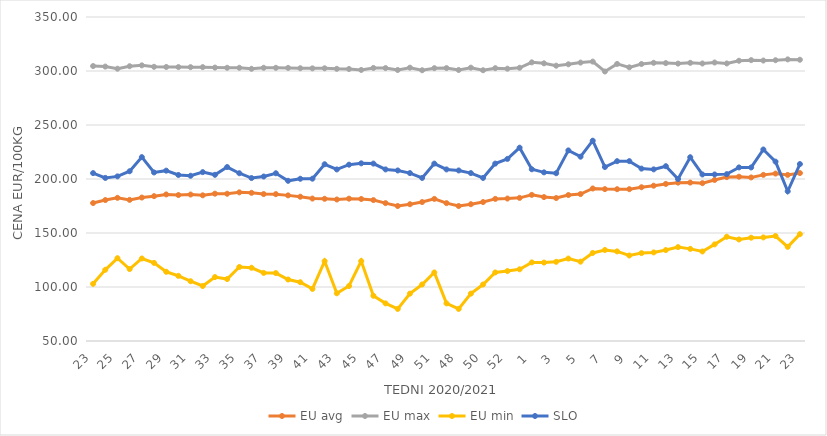
| Category | EU avg | EU max | EU min | SLO |
|---|---|---|---|---|
| 23.0 | 177.741 | 304.59 | 102.918 | 205.46 |
| 24.0 | 180.501 | 304.1 | 115.936 | 201 |
| 25.0 | 182.568 | 302.13 | 126.655 | 202.43 |
| 26.0 | 180.667 | 304.43 | 116.597 | 207.19 |
| 27.0 | 182.833 | 305.22 | 126.397 | 220.25 |
| 28.0 | 184.121 | 303.88 | 122.317 | 206.06 |
| 29.0 | 185.712 | 303.73 | 114.082 | 207.73 |
| 30.0 | 185.141 | 303.63 | 110.314 | 203.73 |
| 31.0 | 185.621 | 303.57 | 105.336 | 203 |
| 32.0 | 184.887 | 303.58 | 100.908 | 206.36 |
| 33.0 | 186.411 | 303.17 | 109.191 | 203.88 |
| 34.0 | 186.338 | 302.96 | 107.355 | 211.07 |
| 35.0 | 187.628 | 302.99 | 118.534 | 205.34 |
| 36.0 | 187.19 | 302.05 | 117.814 | 200.88 |
| 37.0 | 186.038 | 302.98 | 113.058 | 202.29 |
| 38.0 | 185.986 | 302.94 | 112.896 | 205.33 |
| 39.0 | 184.836 | 302.88 | 106.953 | 198.33 |
| 40.0 | 183.595 | 302.56 | 104.426 | 200.21 |
| 41.0 | 181.893 | 302.44 | 98.23 | 200.3 |
| 42.0 | 181.671 | 302.52 | 123.908 | 213.66 |
| 43.0 | 181.023 | 302.01 | 94.177 | 208.86 |
| 44.0 | 181.795 | 301.86 | 100.908 | 213.25 |
| 45.0 | 181.489 | 300.98 | 124 | 214.51 |
| 46.0 | 180.473 | 302.82 | 91.889 | 214.27 |
| 47.0 | 177.656 | 302.7 | 84.832 | 208.87 |
| 48.0 | 174.977 | 300.94 | 79.697 | 207.9 |
| 49.0 | 176.65 | 303.09 | 93.873 | 205.48 |
| 50.0 | 178.648 | 300.7 | 102.316 | 200.99 |
| 51.0 | 181.58 | 302.62 | 113.46 | 214.25 |
| 47.0 | 177.656 | 302.7 | 84.832 | 208.87 |
| 48.0 | 174.977 | 300.94 | 79.697 | 207.9 |
| 49.0 | 176.65 | 303.09 | 93.873 | 205.48 |
| 50.0 | 178.648 | 300.7 | 102.316 | 200.99 |
| 51.0 | 181.58 | 302.62 | 113.46 | 214.25 |
| 52.0 | 181.9 | 302.14 | 114.76 | 218.61 |
| 53.0 | 182.536 | 303 | 116.375 | 229 |
| 1.0 | 185.3 | 308 | 122.769 | 209 |
| 2.0 | 183.25 | 307.1 | 122.609 | 206.15 |
| 3.0 | 182.393 | 304.91 | 123.32 | 205.35 |
| 4.0 | 185.158 | 306.22 | 126.329 | 226.48 |
| 5.0 | 186.04 | 307.79 | 123.461 | 220.65 |
| 6.0 | 191.206 | 308.7 | 131.528 | 235.46 |
| 7.0 | 190.629 | 299.55 | 134.262 | 211.1 |
| 8.0 | 190.57 | 306.55 | 132.97 | 216.51 |
| 9.0 | 190.562 | 303.4 | 129.173 | 216.54 |
| 10.0 | 192.373 | 306.48 | 131.374 | 209.61 |
| 11.0 | 193.79 | 307.58 | 132.024 | 208.91 |
| 12.0 | 195.449 | 307.33 | 134.212 | 211.87 |
| 13.0 | 196.631 | 306.85 | 136.936 | 199.93 |
| 14.0 | 196.702 | 307.56 | 135.297 | 220.15 |
| 15.0 | 196.13 | 306.96 | 132.893 | 204.2 |
| 16.0 | 199.1 | 307.87 | 139.462 | 204.2 |
| 17.0 | 201.754 | 306.98 | 146.538 | 204.51 |
| 18.0 | 202.13 | 309.49 | 144.017 | 210.72 |
| 19.0 | 201.439 | 310.06 | 145.644 | 210.68 |
| 20.0 | 203.834 | 309.69 | 145.911 | 227.32 |
| 21.0 | 205.04 | 309.99 | 147.188 | 216.08 |
| 22.0 | 203.79 | 310.76 | 137.177 | 188.6 |
| 23.0 | 205.51 | 310.41 | 148.928 | 213.84 |